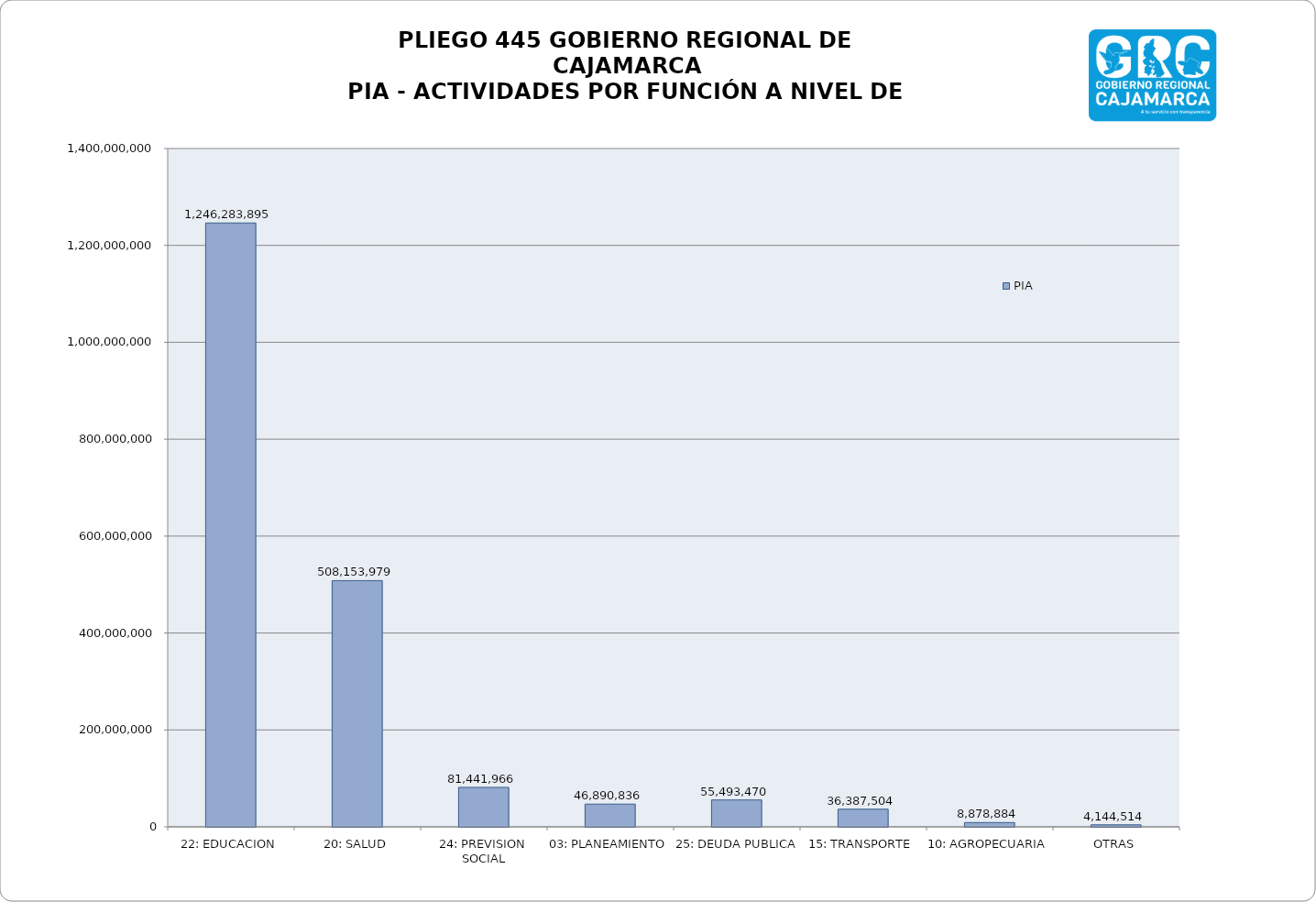
| Category | PIA |
|---|---|
| 22: EDUCACION | 1246283895 |
| 20: SALUD | 508153979 |
| 24: PREVISION SOCIAL | 81441966 |
| 03: PLANEAMIENTO | 46890836 |
| 25: DEUDA PUBLICA | 55493470 |
| 15: TRANSPORTE | 36387504 |
| 10: AGROPECUARIA | 8878884 |
| OTRAS | 4144514 |